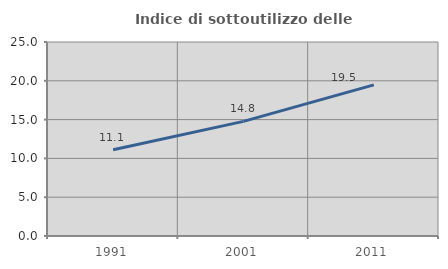
| Category | Indice di sottoutilizzo delle abitazioni  |
|---|---|
| 1991.0 | 11.106 |
| 2001.0 | 14.774 |
| 2011.0 | 19.47 |